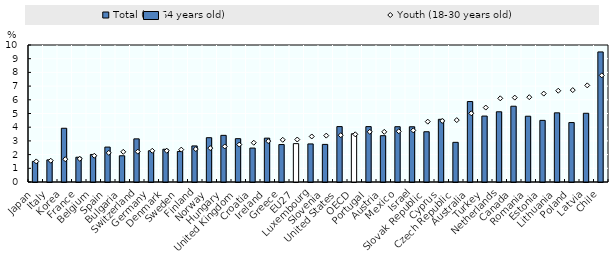
| Category | Total (18-64 years old) |
|---|---|
| Japan | 1.504 |
| Italy | 1.615 |
| Korea | 3.923 |
| France | 1.808 |
| Belgium | 2.01 |
| Spain | 2.548 |
| Bulgaria | 1.915 |
| Switzerland | 3.149 |
| Germany | 2.279 |
| Denmark | 2.391 |
| Sweden | 2.23 |
| Finland | 2.633 |
| Norway | 3.234 |
| Hungary | 3.405 |
| United Kingdom | 3.162 |
| Croatia | 2.477 |
| Ireland | 3.201 |
| Greece | 2.734 |
| EU27 | 2.8 |
| Luxembourg | 2.779 |
| Slovenia | 2.745 |
| United States | 4.045 |
| OECD | 3.521 |
| Portugal | 4.044 |
| Austria | 3.381 |
| Mexico | 4.036 |
| Israel | 4.032 |
| Slovak Republic | 3.668 |
| Cyprus | 4.575 |
| Czech Republic | 2.896 |
| Australia | 5.873 |
| Turkey | 4.813 |
| Netherlands | 5.125 |
| Canada | 5.53 |
| Romania | 4.801 |
| Estonia | 4.499 |
| Lithuania | 5.048 |
| Poland | 4.339 |
| Latvia | 5.016 |
| Chile | 9.494 |